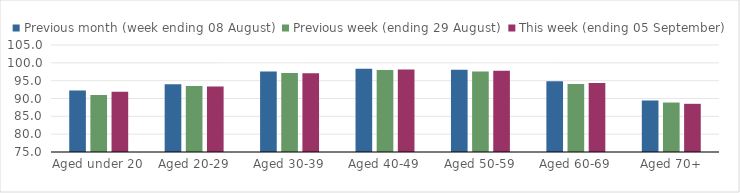
| Category | Previous month (week ending 08 August) | Previous week (ending 29 August) | This week (ending 05 September) |
|---|---|---|---|
| Aged under 20 | 92.22 | 90.99 | 91.89 |
| Aged 20-29 | 93.98 | 93.48 | 93.39 |
| Aged 30-39 | 97.55 | 97.14 | 97.11 |
| Aged 40-49 | 98.37 | 98.02 | 98.15 |
| Aged 50-59 | 98.07 | 97.56 | 97.79 |
| Aged 60-69 | 94.81 | 94.1 | 94.38 |
| Aged 70+ | 89.44 | 88.87 | 88.51 |